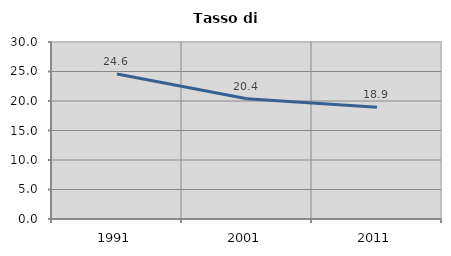
| Category | Tasso di disoccupazione   |
|---|---|
| 1991.0 | 24.576 |
| 2001.0 | 20.395 |
| 2011.0 | 18.933 |